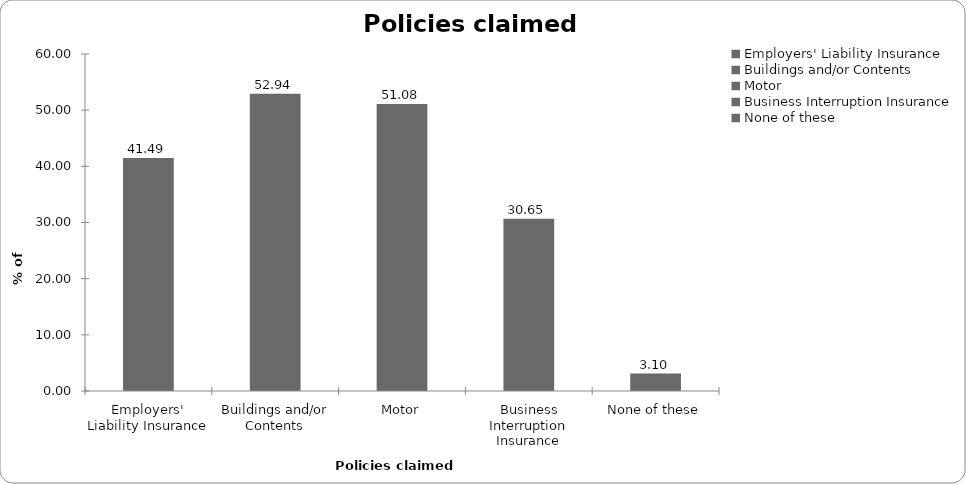
| Category | Series 0 |
|---|---|
| Employers' Liability Insurance | 41.486 |
| Buildings and/or Contents | 52.941 |
| Motor | 51.084 |
| Business Interruption Insurance | 30.65 |
| None of these | 3.096 |